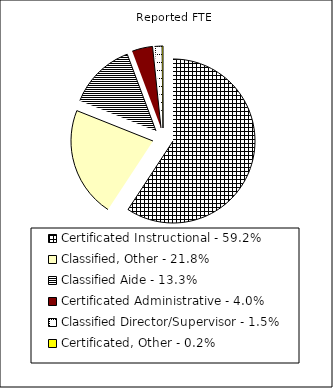
| Category | Reported FTE |
|---|---|
| Certificated Instructional - 59.2% | 72586.59 |
| Classified, Other - 21.8% | 26700.44 |
| Classified Aide - 13.3% | 16242.87 |
| Certificated Administrative - 4.0% | 4972.07 |
| Classified Director/Supervisor - 1.5% | 1799.78 |
| Certificated, Other - 0.2% | 218.69 |